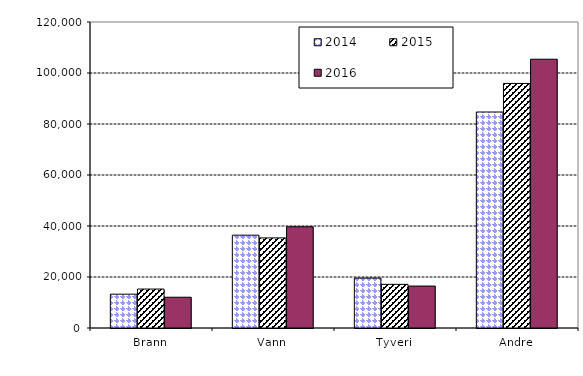
| Category | 2014 | 2015 | 2016 |
|---|---|---|---|
| Brann | 13260 | 15270.717 | 12067.935 |
| Vann | 36404 | 35333.95 | 39707.453 |
| Tyveri | 19583 | 17123.305 | 16448.436 |
| Andre | 84701 | 95912.214 | 105404.836 |